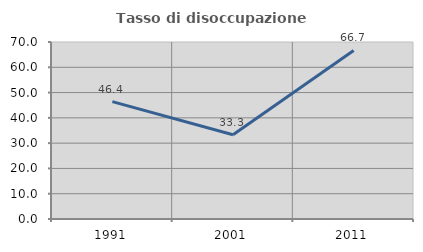
| Category | Tasso di disoccupazione giovanile  |
|---|---|
| 1991.0 | 46.429 |
| 2001.0 | 33.333 |
| 2011.0 | 66.667 |